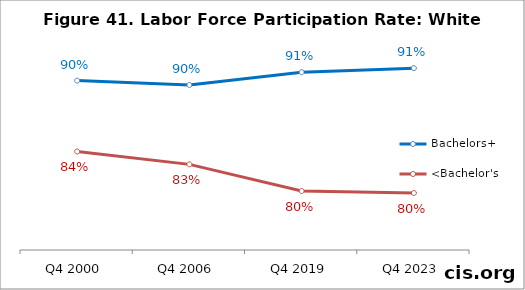
| Category | Bachelors+ | <Bachelor's |
|---|---|---|
| Q4 2000 | 0.901 | 0.838 |
| Q4 2006 | 0.897 | 0.826 |
| Q4 2019 | 0.909 | 0.803 |
| Q4 2023 | 0.912 | 0.801 |